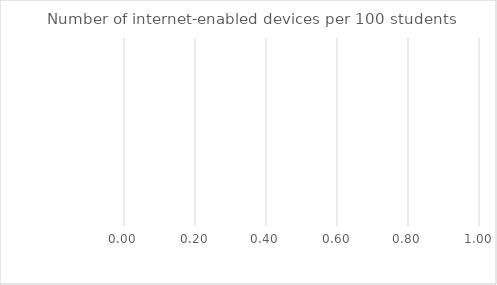
| Category | Benchmark | Entire LEA  | Title IV-A Identified Schools |
|---|---|---|---|
| Number of internet-enabled devices per 100 students | 0 | 0 | 0 |